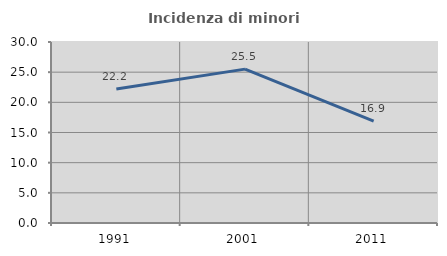
| Category | Incidenza di minori stranieri |
|---|---|
| 1991.0 | 22.222 |
| 2001.0 | 25.503 |
| 2011.0 | 16.895 |